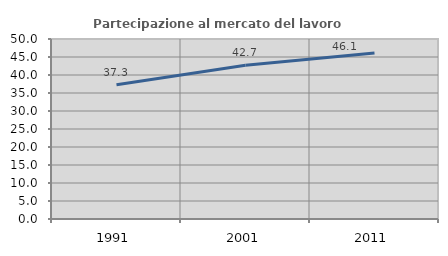
| Category | Partecipazione al mercato del lavoro  femminile |
|---|---|
| 1991.0 | 37.313 |
| 2001.0 | 42.697 |
| 2011.0 | 46.078 |